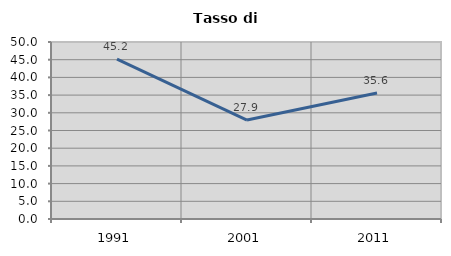
| Category | Tasso di disoccupazione   |
|---|---|
| 1991.0 | 45.161 |
| 2001.0 | 27.946 |
| 2011.0 | 35.602 |